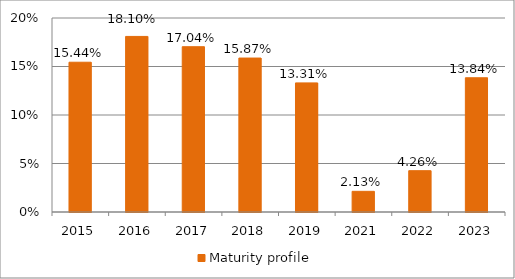
| Category | Maturity profile |
|---|---|
| 2015.0 | 0.154 |
| 2016.0 | 0.181 |
| 2017.0 | 0.17 |
| 2018.0 | 0.159 |
| 2019.0 | 0.133 |
| 2021.0 | 0.021 |
| 2022.0 | 0.043 |
| 2023.0 | 0.138 |